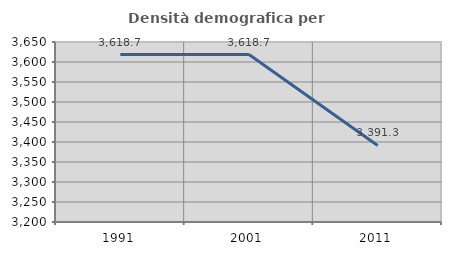
| Category | Densità demografica |
|---|---|
| 1991.0 | 3618.729 |
| 2001.0 | 3618.729 |
| 2011.0 | 3391.304 |